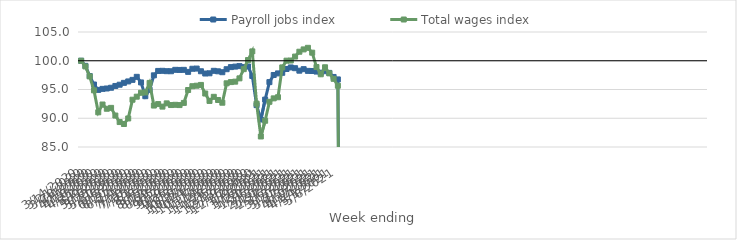
| Category | Payroll jobs index | Total wages index |
|---|---|---|
| 14/03/2020 | 100 | 100 |
| 21/03/2020 | 99.112 | 99.008 |
| 28/03/2020 | 97.347 | 97.272 |
| 04/04/2020 | 95.866 | 94.852 |
| 11/04/2020 | 94.931 | 91.033 |
| 18/04/2020 | 95.11 | 92.389 |
| 25/04/2020 | 95.176 | 91.652 |
| 02/05/2020 | 95.306 | 91.805 |
| 09/05/2020 | 95.615 | 90.469 |
| 16/05/2020 | 95.834 | 89.339 |
| 23/05/2020 | 96.157 | 88.998 |
| 30/05/2020 | 96.404 | 89.962 |
| 06/06/2020 | 96.676 | 93.223 |
| 13/06/2020 | 97.202 | 93.751 |
| 20/06/2020 | 96.229 | 94.432 |
| 27/06/2020 | 93.835 | 94.484 |
| 04/07/2020 | 94.961 | 96.147 |
| 11/07/2020 | 97.464 | 92.209 |
| 18/07/2020 | 98.23 | 92.463 |
| 25/07/2020 | 98.248 | 92.024 |
| 01/08/2020 | 98.187 | 92.589 |
| 08/08/2020 | 98.176 | 92.297 |
| 15/08/2020 | 98.419 | 92.338 |
| 22/08/2020 | 98.4 | 92.292 |
| 29/08/2020 | 98.417 | 92.666 |
| 05/09/2020 | 98.068 | 94.913 |
| 12/09/2020 | 98.606 | 95.573 |
| 19/09/2020 | 98.64 | 95.66 |
| 26/09/2020 | 98.172 | 95.794 |
| 03/10/2020 | 97.778 | 94.297 |
| 10/10/2020 | 97.818 | 93.013 |
| 17/10/2020 | 98.249 | 93.726 |
| 24/10/2020 | 98.164 | 93.175 |
| 31/10/2020 | 98.008 | 92.703 |
| 07/11/2020 | 98.529 | 96.076 |
| 14/11/2020 | 98.894 | 96.29 |
| 21/11/2020 | 98.983 | 96.364 |
| 28/11/2020 | 99.068 | 96.94 |
| 05/12/2020 | 98.895 | 98.536 |
| 12/12/2020 | 99.004 | 100.118 |
| 19/12/2020 | 97.355 | 101.627 |
| 26/12/2020 | 92.282 | 92.548 |
| 02/01/2021 | 89.776 | 86.83 |
| 09/01/2021 | 93.241 | 89.564 |
| 16/01/2021 | 96.284 | 92.862 |
| 23/01/2021 | 97.523 | 93.458 |
| 30/01/2021 | 97.798 | 93.654 |
| 06/02/2021 | 97.904 | 98.844 |
| 13/02/2021 | 98.565 | 100.016 |
| 20/02/2021 | 98.836 | 100.039 |
| 27/02/2021 | 98.705 | 100.727 |
| 06/03/2021 | 98.272 | 101.57 |
| 13/03/2021 | 98.539 | 101.973 |
| 20/03/2021 | 98.239 | 102.248 |
| 27/03/2021 | 98.216 | 101.404 |
| 03/04/2021 | 98.118 | 98.91 |
| 10/04/2021 | 97.926 | 97.646 |
| 17/04/2021 | 98.178 | 98.864 |
| 24/04/2021 | 97.888 | 97.811 |
| 01/05/2021 | 97.182 | 96.86 |
| 08/05/2021 | 96.755 | 95.658 |